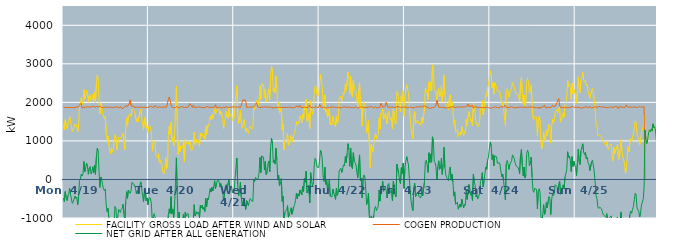
| Category | FACILITY GROSS LOAD AFTER WIND AND SOLAR | COGEN PRODUCTION | NET GRID AFTER ALL GENERATION |
|---|---|---|---|
|  Mon  4/19 | 1412 | 1892 | -480 |
|  Mon  4/19 | 1291 | 1866 | -575 |
|  Mon  4/19 | 1552 | 1867 | -315 |
|  Mon  4/19 | 1397 | 1866 | -469 |
|  Mon  4/19 | 1318 | 1864 | -546 |
|  Mon  4/19 | 1448 | 1869 | -421 |
|  Mon  4/19 | 1499 | 1869 | -370 |
|  Mon  4/19 | 1629 | 1862 | -233 |
|  Mon  4/19 | 1490 | 1882 | -392 |
|  Mon  4/19 | 1362 | 1870 | -508 |
|  Mon  4/19 | 1238 | 1859 | -621 |
|  Mon  4/19 | 1282 | 1861 | -579 |
|  Mon  4/19 | 1300 | 1868 | -568 |
|  Mon  4/19 | 1437 | 1868 | -431 |
|  Mon  4/19 | 1376 | 1870 | -494 |
|  Mon  4/19 | 1420 | 1878 | -458 |
|  Mon  4/19 | 1231 | 1886 | -655 |
|  Mon  4/19 | 1403 | 1878 | -475 |
|  Mon  4/19 | 1889 | 1921 | -32 |
|  Mon  4/19 | 1953 | 1953 | 0 |
|  Mon  4/19 | 2116 | 1979 | 137 |
|  Mon  4/19 | 1944 | 1855 | 89 |
|  Mon  4/19 | 2020 | 1868 | 152 |
|  Mon  4/19 | 2339 | 1873 | 466 |
|  Mon  4/19 | 2080 | 1883 | 197 |
|  Mon  4/19 | 2180 | 1873 | 307 |
|  Mon  4/19 | 2306 | 1883 | 423 |
|  Mon  4/19 | 2222 | 1889 | 333 |
|  Mon  4/19 | 2005 | 1870 | 135 |
|  Mon  4/19 | 2168 | 1873 | 295 |
|  Mon  4/19 | 2199 | 1862 | 337 |
|  Mon  4/19 | 2027 | 1882 | 145 |
|  Mon  4/19 | 2078 | 1878 | 200 |
|  Mon  4/19 | 2217 | 1889 | 328 |
|  Mon  4/19 | 2045 | 1870 | 175 |
|  Mon  4/19 | 2270 | 1897 | 373 |
|  Mon  4/19 | 1995 | 1863 | 132 |
|  Mon  4/19 | 2473 | 1895 | 578 |
|  Mon  4/19 | 2712 | 1905 | 807 |
|  Mon  4/19 | 2614 | 1878 | 736 |
|  Mon  4/19 | 2109 | 1881 | 228 |
|  Mon  4/19 | 1699 | 1905 | -206 |
|  Mon  4/19 | 1980 | 1916 | 64 |
|  Mon  4/19 | 1878 | 1866 | 12 |
|  Mon  4/19 | 1738 | 1878 | -140 |
|  Mon  4/19 | 1617 | 1862 | -245 |
|  Mon  4/19 | 1584 | 1869 | -285 |
|  Mon  4/19 | 1635 | 1879 | -244 |
|  Mon  4/19 | 1233 | 1876 | -643 |
|  Mon  4/19 | 1040 | 1870 | -830 |
|  Mon  4/19 | 1121 | 1870 | -749 |
|  Mon  4/19 | 906 | 1873 | -967 |
|  Mon  4/19 | 749 | 1879 | -1130 |
|  Mon  4/19 | 662 | 1873 | -1211 |
|  Mon  4/19 | 822 | 1886 | -1064 |
|  Mon  4/19 | 706 | 1860 | -1154 |
|  Mon  4/19 | 777 | 1877 | -1100 |
|  Mon  4/19 | 802 | 1873 | -1071 |
|  Mon  4/19 | 1166 | 1870 | -704 |
|  Mon  4/19 | 1132 | 1888 | -756 |
|  Mon  4/19 | 770 | 1870 | -1100 |
|  Mon  4/19 | 869 | 1867 | -998 |
|  Mon  4/19 | 1100 | 1878 | -778 |
|  Mon  4/19 | 1056 | 1857 | -801 |
|  Mon  4/19 | 1039 | 1892 | -853 |
|  Mon  4/19 | 1082 | 1860 | -778 |
|  Mon  4/19 | 1126 | 1876 | -750 |
|  Mon  4/19 | 1196 | 1839 | -643 |
|  Mon  4/19 | 961 | 1852 | -891 |
|  Mon  4/19 | 778 | 1891 | -1113 |
|  Mon  4/19 | 1288 | 1875 | -587 |
|  Mon  4/19 | 1595 | 1912 | -317 |
|  Mon  4/19 | 1395 | 1886 | -491 |
|  Mon  4/19 | 1660 | 1934 | -274 |
|  Mon  4/19 | 1667 | 1981 | -314 |
|  Mon  4/19 | 1704 | 2063 | -359 |
|  Mon  4/19 | 1633 | 1929 | -296 |
|  Mon  4/19 | 1816 | 1891 | -75 |
|  Mon  4/19 | 1802 | 1867 | -65 |
|  Mon  4/19 | 1794 | 1906 | -112 |
|  Mon  4/19 | 1757 | 1867 | -110 |
|  Mon  4/19 | 1622 | 1846 | -224 |
|  Mon  4/19 | 1502 | 1878 | -376 |
|  Mon  4/19 | 1598 | 1889 | -291 |
|  Mon  4/19 | 1507 | 1869 | -362 |
|  Mon  4/19 | 1529 | 1863 | -334 |
|  Mon  4/19 | 1742 | 1879 | -137 |
|  Mon  4/19 | 1817 | 1879 | -62 |
|  Mon  4/19 | 1637 | 1874 | -237 |
|  Mon  4/19 | 1465 | 1876 | -411 |
|  Mon  4/19 | 1287 | 1864 | -577 |
|  Mon  4/19 | 1531 | 1870 | -339 |
|  Mon  4/19 | 1620 | 1877 | -257 |
|  Mon  4/19 | 1331 | 1884 | -553 |
|  Mon  4/19 | 1386 | 1864 | -478 |
|  Mon  4/19 | 1216 | 1871 | -655 |
|  Tue  4/20 | 1373 | 1880 | -507 |
|  Tue  4/20 | 1404 | 1871 | -467 |
|  Tue  4/20 | 1393 | 1898 | -505 |
|  Tue  4/20 | 1224 | 1884 | -660 |
|  Tue  4/20 | 733 | 1874 | -1141 |
|  Tue  4/20 | 906 | 1869 | -963 |
|  Tue  4/20 | 990 | 1877 | -887 |
|  Tue  4/20 | 951 | 1919 | -968 |
|  Tue  4/20 | 616 | 1920 | -1304 |
|  Tue  4/20 | 610 | 1878 | -1268 |
|  Tue  4/20 | 556 | 1866 | -1310 |
|  Tue  4/20 | 667 | 1862 | -1195 |
|  Tue  4/20 | 430 | 1893 | -1463 |
|  Tue  4/20 | 508 | 1873 | -1365 |
|  Tue  4/20 | 412 | 1870 | -1458 |
|  Tue  4/20 | 357 | 1874 | -1517 |
|  Tue  4/20 | 177 | 1879 | -1702 |
|  Tue  4/20 | 140 | 1875 | -1735 |
|  Tue  4/20 | 257 | 1876 | -1619 |
|  Tue  4/20 | 572 | 1854 | -1282 |
|  Tue  4/20 | 276 | 1878 | -1602 |
|  Tue  4/20 | 311 | 1901 | -1590 |
|  Tue  4/20 | 1166 | 2079 | -913 |
|  Tue  4/20 | 1376 | 2139 | -763 |
|  Tue  4/20 | 1165 | 2045 | -880 |
|  Tue  4/20 | 1488 | 1932 | -444 |
|  Tue  4/20 | 983 | 1871 | -888 |
|  Tue  4/20 | 1091 | 1868 | -777 |
|  Tue  4/20 | 876 | 1861 | -985 |
|  Tue  4/20 | 1185 | 1857 | -672 |
|  Tue  4/20 | 1793 | 1866 | -73 |
|  Tue  4/20 | 2425 | 1865 | 560 |
|  Tue  4/20 | 1514 | 1892 | -378 |
|  Tue  4/20 | 645 | 1874 | -1229 |
|  Tue  4/20 | 1008 | 1854 | -846 |
|  Tue  4/20 | 722 | 1873 | -1151 |
|  Tue  4/20 | 867 | 1884 | -1017 |
|  Tue  4/20 | 805 | 1886 | -1081 |
|  Tue  4/20 | 843 | 1885 | -1042 |
|  Tue  4/20 | 988 | 1885 | -897 |
|  Tue  4/20 | 460 | 1866 | -1406 |
|  Tue  4/20 | 1046 | 1890 | -844 |
|  Tue  4/20 | 915 | 1870 | -955 |
|  Tue  4/20 | 950 | 1867 | -917 |
|  Tue  4/20 | 991 | 1872 | -881 |
|  Tue  4/20 | 908 | 1903 | -995 |
|  Tue  4/20 | 987 | 1966 | -979 |
|  Tue  4/20 | 831 | 1941 | -1110 |
|  Tue  4/20 | 738 | 1921 | -1183 |
|  Tue  4/20 | 784 | 1865 | -1081 |
|  Tue  4/20 | 886 | 1926 | -1040 |
|  Tue  4/20 | 1228 | 1880 | -652 |
|  Tue  4/20 | 908 | 1854 | -946 |
|  Tue  4/20 | 943 | 1871 | -928 |
|  Tue  4/20 | 1038 | 1875 | -837 |
|  Tue  4/20 | 959 | 1850 | -891 |
|  Tue  4/20 | 1023 | 1881 | -858 |
|  Tue  4/20 | 864 | 1858 | -994 |
|  Tue  4/20 | 1205 | 1877 | -672 |
|  Tue  4/20 | 1133 | 1874 | -741 |
|  Tue  4/20 | 1193 | 1859 | -666 |
|  Tue  4/20 | 1090 | 1867 | -777 |
|  Tue  4/20 | 1146 | 1866 | -720 |
|  Tue  4/20 | 1041 | 1874 | -833 |
|  Tue  4/20 | 1385 | 1874 | -489 |
|  Tue  4/20 | 1165 | 1879 | -714 |
|  Tue  4/20 | 1403 | 1894 | -491 |
|  Tue  4/20 | 1360 | 1890 | -530 |
|  Tue  4/20 | 1478 | 1865 | -387 |
|  Tue  4/20 | 1636 | 1875 | -239 |
|  Tue  4/20 | 1548 | 1875 | -327 |
|  Tue  4/20 | 1687 | 1894 | -207 |
|  Tue  4/20 | 1568 | 1866 | -298 |
|  Tue  4/20 | 1677 | 1871 | -194 |
|  Tue  4/20 | 1843 | 1874 | -31 |
|  Tue  4/20 | 1703 | 1939 | -236 |
|  Tue  4/20 | 1750 | 1869 | -119 |
|  Tue  4/20 | 1826 | 1865 | -39 |
|  Tue  4/20 | 1847 | 1860 | -13 |
|  Tue  4/20 | 1821 | 1880 | -59 |
|  Tue  4/20 | 1688 | 1881 | -193 |
|  Tue  4/20 | 1763 | 1865 | -102 |
|  Tue  4/20 | 1744 | 1846 | -102 |
|  Tue  4/20 | 1619 | 1864 | -245 |
|  Tue  4/20 | 1327 | 1875 | -548 |
|  Tue  4/20 | 1463 | 1869 | -406 |
|  Tue  4/20 | 1596 | 1863 | -267 |
|  Tue  4/20 | 1765 | 1899 | -134 |
|  Tue  4/20 | 1636 | 1914 | -278 |
|  Tue  4/20 | 1579 | 1858 | -279 |
|  Tue  4/20 | 1871 | 1871 | 0 |
|  Tue  4/20 | 1636 | 1874 | -238 |
|  Tue  4/20 | 1650 | 1871 | -221 |
|  Tue  4/20 | 1711 | 1879 | -168 |
|  Tue  4/20 | 1529 | 1872 | -343 |
|  Tue  4/20 | 1546 | 1882 | -336 |
|  Wed  4/21 | 1589 | 1877 | -288 |
|  Wed  4/21 | 1901 | 1879 | 22 |
|  Wed  4/21 | 2195 | 1882 | 313 |
|  Wed  4/21 | 2430 | 1874 | 556 |
|  Wed  4/21 | 1721 | 1855 | -134 |
|  Wed  4/21 | 1456 | 1882 | -426 |
|  Wed  4/21 | 1593 | 1864 | -271 |
|  Wed  4/21 | 1795 | 1868 | -73 |
|  Wed  4/21 | 1459 | 1923 | -464 |
|  Wed  4/21 | 1330 | 2009 | -679 |
|  Wed  4/21 | 1397 | 2069 | -672 |
|  Wed  4/21 | 1553 | 2037 | -484 |
|  Wed  4/21 | 1416 | 2070 | -654 |
|  Wed  4/21 | 1246 | 2026 | -780 |
|  Wed  4/21 | 1322 | 1871 | -549 |
|  Wed  4/21 | 1346 | 1879 | -533 |
|  Wed  4/21 | 1195 | 1871 | -676 |
|  Wed  4/21 | 1314 | 1896 | -582 |
|  Wed  4/21 | 1378 | 1873 | -495 |
|  Wed  4/21 | 1332 | 1867 | -535 |
|  Wed  4/21 | 1352 | 1879 | -527 |
|  Wed  4/21 | 1312 | 1886 | -574 |
|  Wed  4/21 | 1865 | 1877 | -12 |
|  Wed  4/21 | 1818 | 1877 | -59 |
|  Wed  4/21 | 1989 | 1937 | 52 |
|  Wed  4/21 | 2063 | 1992 | 71 |
|  Wed  4/21 | 1983 | 1986 | -3 |
|  Wed  4/21 | 1913 | 1880 | 33 |
|  Wed  4/21 | 2054 | 1888 | 166 |
|  Wed  4/21 | 2433 | 1862 | 571 |
|  Wed  4/21 | 2062 | 1884 | 178 |
|  Wed  4/21 | 2487 | 1875 | 612 |
|  Wed  4/21 | 2503 | 1886 | 617 |
|  Wed  4/21 | 2460 | 1881 | 579 |
|  Wed  4/21 | 2115 | 1872 | 243 |
|  Wed  4/21 | 2347 | 1882 | 465 |
|  Wed  4/21 | 2007 | 1885 | 122 |
|  Wed  4/21 | 2040 | 1879 | 161 |
|  Wed  4/21 | 2271 | 1863 | 408 |
|  Wed  4/21 | 2348 | 1871 | 477 |
|  Wed  4/21 | 2069 | 1866 | 203 |
|  Wed  4/21 | 2702 | 1875 | 827 |
|  Wed  4/21 | 2942 | 1875 | 1067 |
|  Wed  4/21 | 2806 | 1875 | 931 |
|  Wed  4/21 | 2279 | 1837 | 442 |
|  Wed  4/21 | 2366 | 1868 | 498 |
|  Wed  4/21 | 2255 | 1857 | 398 |
|  Wed  4/21 | 2680 | 1870 | 810 |
|  Wed  4/21 | 2365 | 1852 | 513 |
|  Wed  4/21 | 1862 | 1869 | -7 |
|  Wed  4/21 | 2002 | 1891 | 111 |
|  Wed  4/21 | 1718 | 1880 | -162 |
|  Wed  4/21 | 1737 | 1869 | -132 |
|  Wed  4/21 | 1879 | 1859 | 20 |
|  Wed  4/21 | 1300 | 1867 | -567 |
|  Wed  4/21 | 1433 | 1871 | -438 |
|  Wed  4/21 | 770 | 1871 | -1101 |
|  Wed  4/21 | 1012 | 1874 | -862 |
|  Wed  4/21 | 1035 | 1883 | -848 |
|  Wed  4/21 | 1087 | 1868 | -781 |
|  Wed  4/21 | 1192 | 1872 | -680 |
|  Wed  4/21 | 889 | 1868 | -979 |
|  Wed  4/21 | 947 | 1872 | -925 |
|  Wed  4/21 | 961 | 1877 | -916 |
|  Wed  4/21 | 1139 | 1873 | -734 |
|  Wed  4/21 | 961 | 1863 | -902 |
|  Wed  4/21 | 954 | 1862 | -908 |
|  Wed  4/21 | 1147 | 1859 | -712 |
|  Wed  4/21 | 1198 | 1850 | -652 |
|  Wed  4/21 | 1340 | 1881 | -541 |
|  Wed  4/21 | 1511 | 1866 | -355 |
|  Wed  4/21 | 1405 | 1911 | -506 |
|  Wed  4/21 | 1497 | 1866 | -369 |
|  Wed  4/21 | 1455 | 1884 | -429 |
|  Wed  4/21 | 1652 | 1924 | -272 |
|  Wed  4/21 | 1583 | 1860 | -277 |
|  Wed  4/21 | 1473 | 1874 | -401 |
|  Wed  4/21 | 1696 | 1867 | -171 |
|  Wed  4/21 | 1566 | 1877 | -311 |
|  Wed  4/21 | 1905 | 1876 | 29 |
|  Wed  4/21 | 1811 | 1883 | -72 |
|  Wed  4/21 | 2086 | 1868 | 218 |
|  Wed  4/21 | 1511 | 1861 | -350 |
|  Wed  4/21 | 1573 | 1863 | -290 |
|  Wed  4/21 | 1724 | 1873 | -149 |
|  Wed  4/21 | 1320 | 1931 | -611 |
|  Wed  4/21 | 2044 | 1869 | 175 |
|  Wed  4/21 | 1866 | 1884 | -18 |
|  Wed  4/21 | 1693 | 1865 | -172 |
|  Wed  4/21 | 1753 | 1876 | -123 |
|  Wed  4/21 | 2228 | 1864 | 364 |
|  Wed  4/21 | 2431 | 1881 | 550 |
|  Wed  4/21 | 2405 | 1896 | 509 |
|  Wed  4/21 | 2195 | 1866 | 329 |
|  Wed  4/21 | 2194 | 1870 | 324 |
|  Wed  4/21 | 2171 | 1866 | 305 |
|  Thu  4/22 | 2428 | 1953 | 475 |
|  Thu  4/22 | 2726 | 1969 | 757 |
|  Thu  4/22 | 2557 | 1861 | 696 |
|  Thu  4/22 | 2418 | 1873 | 545 |
|  Thu  4/22 | 1965 | 1875 | 90 |
|  Thu  4/22 | 1820 | 1871 | -51 |
|  Thu  4/22 | 2192 | 1874 | 318 |
|  Thu  4/22 | 1741 | 1869 | -128 |
|  Thu  4/22 | 1826 | 1845 | -19 |
|  Thu  4/22 | 1615 | 1873 | -258 |
|  Thu  4/22 | 1695 | 1884 | -189 |
|  Thu  4/22 | 1872 | 1864 | 8 |
|  Thu  4/22 | 1422 | 1855 | -433 |
|  Thu  4/22 | 1456 | 1872 | -416 |
|  Thu  4/22 | 1413 | 1864 | -451 |
|  Thu  4/22 | 1637 | 1884 | -247 |
|  Thu  4/22 | 1510 | 1870 | -360 |
|  Thu  4/22 | 1440 | 1872 | -432 |
|  Thu  4/22 | 1361 | 1877 | -516 |
|  Thu  4/22 | 1642 | 1868 | -226 |
|  Thu  4/22 | 1460 | 1873 | -413 |
|  Thu  4/22 | 1510 | 1869 | -359 |
|  Thu  4/22 | 2082 | 1869 | 213 |
|  Thu  4/22 | 2093 | 1860 | 233 |
|  Thu  4/22 | 2165 | 1877 | 288 |
|  Thu  4/22 | 2046 | 1863 | 183 |
|  Thu  4/22 | 2148 | 1865 | 283 |
|  Thu  4/22 | 2265 | 1883 | 382 |
|  Thu  4/22 | 2219 | 1866 | 353 |
|  Thu  4/22 | 2475 | 1881 | 594 |
|  Thu  4/22 | 2305 | 1877 | 428 |
|  Thu  4/22 | 2538 | 1866 | 672 |
|  Thu  4/22 | 2778 | 1849 | 929 |
|  Thu  4/22 | 2659 | 1880 | 779 |
|  Thu  4/22 | 2225 | 1885 | 340 |
|  Thu  4/22 | 2678 | 1864 | 814 |
|  Thu  4/22 | 2203 | 1875 | 328 |
|  Thu  4/22 | 2143 | 1864 | 279 |
|  Thu  4/22 | 2581 | 1886 | 695 |
|  Thu  4/22 | 2337 | 1861 | 476 |
|  Thu  4/22 | 2302 | 1868 | 434 |
|  Thu  4/22 | 2269 | 1890 | 379 |
|  Thu  4/22 | 2069 | 1889 | 180 |
|  Thu  4/22 | 1891 | 1850 | 41 |
|  Thu  4/22 | 2284 | 1871 | 413 |
|  Thu  4/22 | 2509 | 1872 | 637 |
|  Thu  4/22 | 1831 | 1868 | -37 |
|  Thu  4/22 | 1918 | 1881 | 37 |
|  Thu  4/22 | 1386 | 1866 | -480 |
|  Thu  4/22 | 1913 | 1874 | 39 |
|  Thu  4/22 | 2002 | 1884 | 118 |
|  Thu  4/22 | 1929 | 1866 | 63 |
|  Thu  4/22 | 1587 | 1857 | -270 |
|  Thu  4/22 | 1214 | 1864 | -650 |
|  Thu  4/22 | 1330 | 1875 | -545 |
|  Thu  4/22 | 1528 | 1881 | -353 |
|  Thu  4/22 | 941 | 1878 | -937 |
|  Thu  4/22 | 314 | 1880 | -1566 |
|  Thu  4/22 | 915 | 1860 | -945 |
|  Thu  4/22 | 912 | 1888 | -976 |
|  Thu  4/22 | 727 | 1866 | -1139 |
|  Thu  4/22 | 928 | 1853 | -925 |
|  Thu  4/22 | 1115 | 1876 | -761 |
|  Thu  4/22 | 1187 | 1886 | -699 |
|  Thu  4/22 | 1052 | 1860 | -808 |
|  Thu  4/22 | 1128 | 1883 | -755 |
|  Thu  4/22 | 1167 | 1860 | -693 |
|  Thu  4/22 | 1600 | 1871 | -271 |
|  Thu  4/22 | 1306 | 1869 | -563 |
|  Thu  4/22 | 1708 | 1984 | -276 |
|  Thu  4/22 | 1737 | 1977 | -240 |
|  Thu  4/22 | 1830 | 1873 | -43 |
|  Thu  4/22 | 1563 | 1869 | -306 |
|  Thu  4/22 | 1628 | 1881 | -253 |
|  Thu  4/22 | 1726 | 1911 | -185 |
|  Thu  4/22 | 1724 | 2003 | -279 |
|  Thu  4/22 | 1445 | 1925 | -480 |
|  Thu  4/22 | 1730 | 1867 | -137 |
|  Thu  4/22 | 1770 | 1872 | -102 |
|  Thu  4/22 | 1589 | 1874 | -285 |
|  Thu  4/22 | 1533 | 1882 | -349 |
|  Thu  4/22 | 1611 | 1876 | -265 |
|  Thu  4/22 | 1316 | 1873 | -557 |
|  Thu  4/22 | 1826 | 1876 | -50 |
|  Thu  4/22 | 1677 | 1885 | -208 |
|  Thu  4/22 | 1462 | 1865 | -403 |
|  Thu  4/22 | 1432 | 1886 | -454 |
|  Thu  4/22 | 2284 | 1888 | 396 |
|  Thu  4/22 | 2248 | 1871 | 377 |
|  Thu  4/22 | 2049 | 1886 | 163 |
|  Thu  4/22 | 1839 | 1881 | -42 |
|  Thu  4/22 | 1758 | 1867 | -109 |
|  Thu  4/22 | 2168 | 1862 | 306 |
|  Thu  4/22 | 2022 | 1874 | 148 |
|  Thu  4/22 | 2304 | 1878 | 426 |
|  Thu  4/22 | 1642 | 1876 | -234 |
|  Fri  4/23 | 2155 | 1869 | 286 |
|  Fri  4/23 | 2352 | 1880 | 472 |
|  Fri  4/23 | 2456 | 1865 | 591 |
|  Fri  4/23 | 2331 | 1850 | 481 |
|  Fri  4/23 | 2248 | 1868 | 380 |
|  Fri  4/23 | 1906 | 1878 | 28 |
|  Fri  4/23 | 1894 | 1888 | 6 |
|  Fri  4/23 | 1292 | 1870 | -578 |
|  Fri  4/23 | 1141 | 1867 | -726 |
|  Fri  4/23 | 1055 | 1863 | -808 |
|  Fri  4/23 | 1672 | 1879 | -207 |
|  Fri  4/23 | 1762 | 1859 | -97 |
|  Fri  4/23 | 1441 | 1887 | -446 |
|  Fri  4/23 | 1488 | 1880 | -392 |
|  Fri  4/23 | 1543 | 1878 | -335 |
|  Fri  4/23 | 1504 | 1872 | -368 |
|  Fri  4/23 | 1434 | 1883 | -449 |
|  Fri  4/23 | 1426 | 1870 | -444 |
|  Fri  4/23 | 1410 | 1885 | -475 |
|  Fri  4/23 | 1622 | 1882 | -260 |
|  Fri  4/23 | 1460 | 1885 | -425 |
|  Fri  4/23 | 1439 | 1889 | -450 |
|  Fri  4/23 | 1855 | 1915 | -60 |
|  Fri  4/23 | 2368 | 1902 | 466 |
|  Fri  4/23 | 2377 | 1879 | 498 |
|  Fri  4/23 | 2247 | 1862 | 385 |
|  Fri  4/23 | 2062 | 1880 | 182 |
|  Fri  4/23 | 2537 | 1844 | 693 |
|  Fri  4/23 | 2297 | 1859 | 438 |
|  Fri  4/23 | 2514 | 1852 | 662 |
|  Fri  4/23 | 2302 | 1855 | 447 |
|  Fri  4/23 | 2972 | 1866 | 1106 |
|  Fri  4/23 | 2865 | 1873 | 992 |
|  Fri  4/23 | 2336 | 1868 | 468 |
|  Fri  4/23 | 2325 | 1890 | 435 |
|  Fri  4/23 | 2250 | 1931 | 319 |
|  Fri  4/23 | 2036 | 2052 | -16 |
|  Fri  4/23 | 2291 | 1961 | 330 |
|  Fri  4/23 | 2360 | 1875 | 485 |
|  Fri  4/23 | 2138 | 1877 | 261 |
|  Fri  4/23 | 2167 | 1875 | 292 |
|  Fri  4/23 | 2427 | 1876 | 551 |
|  Fri  4/23 | 2004 | 1871 | 133 |
|  Fri  4/23 | 2277 | 1891 | 386 |
|  Fri  4/23 | 2703 | 1868 | 835 |
|  Fri  4/23 | 2186 | 1876 | 310 |
|  Fri  4/23 | 1970 | 1851 | 119 |
|  Fri  4/23 | 1919 | 1870 | 49 |
|  Fri  4/23 | 1909 | 1865 | 44 |
|  Fri  4/23 | 1811 | 1842 | -31 |
|  Fri  4/23 | 2098 | 1863 | 235 |
|  Fri  4/23 | 2197 | 1872 | 325 |
|  Fri  4/23 | 1861 | 1880 | -19 |
|  Fri  4/23 | 2002 | 1869 | 133 |
|  Fri  4/23 | 1817 | 1886 | -69 |
|  Fri  4/23 | 1432 | 1864 | -432 |
|  Fri  4/23 | 1549 | 1871 | -322 |
|  Fri  4/23 | 1227 | 1869 | -642 |
|  Fri  4/23 | 1215 | 1871 | -656 |
|  Fri  4/23 | 1289 | 1879 | -590 |
|  Fri  4/23 | 1112 | 1883 | -771 |
|  Fri  4/23 | 1093 | 1861 | -768 |
|  Fri  4/23 | 1232 | 1872 | -640 |
|  Fri  4/23 | 1152 | 1870 | -718 |
|  Fri  4/23 | 1372 | 1884 | -512 |
|  Fri  4/23 | 1253 | 1876 | -623 |
|  Fri  4/23 | 1141 | 1879 | -738 |
|  Fri  4/23 | 1245 | 1887 | -642 |
|  Fri  4/23 | 1213 | 1881 | -668 |
|  Fri  4/23 | 1566 | 1863 | -297 |
|  Fri  4/23 | 1393 | 1911 | -518 |
|  Fri  4/23 | 1620 | 1956 | -336 |
|  Fri  4/23 | 1757 | 1886 | -129 |
|  Fri  4/23 | 1642 | 1903 | -261 |
|  Fri  4/23 | 1506 | 1914 | -408 |
|  Fri  4/23 | 1567 | 1881 | -314 |
|  Fri  4/23 | 1386 | 1932 | -546 |
|  Fri  4/23 | 1985 | 1846 | 139 |
|  Fri  4/23 | 1825 | 1886 | -61 |
|  Fri  4/23 | 1728 | 1877 | -149 |
|  Fri  4/23 | 1431 | 1886 | -455 |
|  Fri  4/23 | 1470 | 1864 | -394 |
|  Fri  4/23 | 1357 | 1863 | -506 |
|  Fri  4/23 | 1383 | 1868 | -485 |
|  Fri  4/23 | 1502 | 1870 | -368 |
|  Fri  4/23 | 1805 | 1854 | -49 |
|  Fri  4/23 | 1866 | 1863 | 3 |
|  Fri  4/23 | 2052 | 1875 | 177 |
|  Fri  4/23 | 1679 | 1870 | -191 |
|  Fri  4/23 | 1836 | 1868 | -32 |
|  Fri  4/23 | 2014 | 1862 | 152 |
|  Fri  4/23 | 2202 | 1878 | 324 |
|  Fri  4/23 | 2147 | 1882 | 265 |
|  Fri  4/23 | 2385 | 1889 | 496 |
|  Fri  4/23 | 2447 | 1863 | 584 |
|  Fri  4/23 | 2657 | 1849 | 808 |
|  Sat  4/24 | 2821 | 1848 | 973 |
|  Sat  4/24 | 2728 | 1858 | 870 |
|  Sat  4/24 | 2377 | 1859 | 518 |
|  Sat  4/24 | 2508 | 1865 | 643 |
|  Sat  4/24 | 2217 | 1866 | 351 |
|  Sat  4/24 | 2512 | 1899 | 613 |
|  Sat  4/24 | 2463 | 1870 | 593 |
|  Sat  4/24 | 2478 | 1888 | 590 |
|  Sat  4/24 | 2291 | 1871 | 420 |
|  Sat  4/24 | 2293 | 1891 | 402 |
|  Sat  4/24 | 2290 | 1855 | 435 |
|  Sat  4/24 | 2256 | 1873 | 383 |
|  Sat  4/24 | 2101 | 1899 | 202 |
|  Sat  4/24 | 1940 | 1872 | 68 |
|  Sat  4/24 | 2011 | 1871 | 140 |
|  Sat  4/24 | 1835 | 1879 | -44 |
|  Sat  4/24 | 1848 | 1881 | -33 |
|  Sat  4/24 | 1401 | 1931 | -530 |
|  Sat  4/24 | 2268 | 1864 | 404 |
|  Sat  4/24 | 2353 | 1860 | 493 |
|  Sat  4/24 | 2273 | 1863 | 410 |
|  Sat  4/24 | 2130 | 1868 | 262 |
|  Sat  4/24 | 2259 | 1873 | 386 |
|  Sat  4/24 | 2261 | 1882 | 379 |
|  Sat  4/24 | 2375 | 1890 | 485 |
|  Sat  4/24 | 2513 | 1875 | 638 |
|  Sat  4/24 | 2491 | 1863 | 628 |
|  Sat  4/24 | 2405 | 1864 | 541 |
|  Sat  4/24 | 2284 | 1861 | 423 |
|  Sat  4/24 | 2226 | 1872 | 354 |
|  Sat  4/24 | 2236 | 1870 | 366 |
|  Sat  4/24 | 2201 | 1881 | 320 |
|  Sat  4/24 | 2138 | 1871 | 267 |
|  Sat  4/24 | 2023 | 1874 | 149 |
|  Sat  4/24 | 2491 | 1878 | 613 |
|  Sat  4/24 | 2648 | 1872 | 776 |
|  Sat  4/24 | 2253 | 1877 | 376 |
|  Sat  4/24 | 1967 | 1873 | 94 |
|  Sat  4/24 | 2189 | 1866 | 323 |
|  Sat  4/24 | 1910 | 1873 | 37 |
|  Sat  4/24 | 1997 | 1883 | 114 |
|  Sat  4/24 | 2545 | 1870 | 675 |
|  Sat  4/24 | 2620 | 1861 | 759 |
|  Sat  4/24 | 2534 | 1851 | 683 |
|  Sat  4/24 | 2238 | 1884 | 354 |
|  Sat  4/24 | 2264 | 1867 | 397 |
|  Sat  4/24 | 2457 | 1878 | 579 |
|  Sat  4/24 | 1930 | 1864 | 66 |
|  Sat  4/24 | 1592 | 1877 | -285 |
|  Sat  4/24 | 1537 | 1871 | -334 |
|  Sat  4/24 | 1634 | 1865 | -231 |
|  Sat  4/24 | 1644 | 1860 | -216 |
|  Sat  4/24 | 1611 | 1865 | -254 |
|  Sat  4/24 | 1122 | 1885 | -763 |
|  Sat  4/24 | 1537 | 1848 | -311 |
|  Sat  4/24 | 1640 | 1881 | -241 |
|  Sat  4/24 | 1499 | 1842 | -343 |
|  Sat  4/24 | 909 | 1878 | -969 |
|  Sat  4/24 | 800 | 1893 | -1093 |
|  Sat  4/24 | 950 | 1874 | -924 |
|  Sat  4/24 | 1218 | 1872 | -654 |
|  Sat  4/24 | 1024 | 1933 | -909 |
|  Sat  4/24 | 990 | 1858 | -868 |
|  Sat  4/24 | 1277 | 1874 | -597 |
|  Sat  4/24 | 1133 | 1870 | -737 |
|  Sat  4/24 | 1141 | 1876 | -735 |
|  Sat  4/24 | 1426 | 1873 | -447 |
|  Sat  4/24 | 1371 | 1872 | -501 |
|  Sat  4/24 | 947 | 1859 | -912 |
|  Sat  4/24 | 1349 | 1875 | -526 |
|  Sat  4/24 | 1563 | 1925 | -362 |
|  Sat  4/24 | 1464 | 1882 | -418 |
|  Sat  4/24 | 1507 | 1870 | -363 |
|  Sat  4/24 | 1759 | 1895 | -136 |
|  Sat  4/24 | 1760 | 1881 | -121 |
|  Sat  4/24 | 1809 | 1993 | -184 |
|  Sat  4/24 | 1729 | 2008 | -279 |
|  Sat  4/24 | 1835 | 2100 | -265 |
|  Sat  4/24 | 1879 | 1927 | -48 |
|  Sat  4/24 | 1484 | 1865 | -381 |
|  Sat  4/24 | 1524 | 1880 | -356 |
|  Sat  4/24 | 1648 | 1868 | -220 |
|  Sat  4/24 | 1727 | 1867 | -140 |
|  Sat  4/24 | 1614 | 1861 | -247 |
|  Sat  4/24 | 1926 | 1871 | 55 |
|  Sat  4/24 | 1951 | 1876 | 75 |
|  Sat  4/24 | 2113 | 1858 | 255 |
|  Sat  4/24 | 2571 | 1852 | 719 |
|  Sat  4/24 | 2412 | 1839 | 573 |
|  Sat  4/24 | 2481 | 1872 | 609 |
|  Sat  4/24 | 2381 | 1878 | 503 |
|  Sat  4/24 | 2076 | 1870 | 206 |
|  Sat  4/24 | 2498 | 1906 | 592 |
|  Sat  4/24 | 2225 | 1890 | 335 |
|  Sat  4/24 | 2343 | 1872 | 471 |
|  Sat  4/24 | 2254 | 1880 | 374 |
|  Sun  4/25 | 2183 | 1876 | 307 |
|  Sun  4/25 | 1978 | 1877 | 101 |
|  Sun  4/25 | 2292 | 1874 | 418 |
|  Sun  4/25 | 2668 | 1880 | 788 |
|  Sun  4/25 | 2329 | 1876 | 453 |
|  Sun  4/25 | 2251 | 1864 | 387 |
|  Sun  4/25 | 2599 | 1850 | 749 |
|  Sun  4/25 | 2636 | 1869 | 767 |
|  Sun  4/25 | 2781 | 1855 | 926 |
|  Sun  4/25 | 2585 | 1872 | 713 |
|  Sun  4/25 | 2524 | 1880 | 644 |
|  Sun  4/25 | 2571 | 1866 | 705 |
|  Sun  4/25 | 2423 | 1887 | 536 |
|  Sun  4/25 | 2464 | 1888 | 576 |
|  Sun  4/25 | 2294 | 1857 | 437 |
|  Sun  4/25 | 2276 | 1887 | 389 |
|  Sun  4/25 | 2101 | 1872 | 229 |
|  Sun  4/25 | 2118 | 1876 | 242 |
|  Sun  4/25 | 2308 | 1847 | 461 |
|  Sun  4/25 | 2359 | 1857 | 502 |
|  Sun  4/25 | 2230 | 1875 | 355 |
|  Sun  4/25 | 2061 | 1872 | 189 |
|  Sun  4/25 | 1789 | 1881 | -92 |
|  Sun  4/25 | 1433 | 1858 | -425 |
|  Sun  4/25 | 1375 | 1866 | -491 |
|  Sun  4/25 | 1128 | 1854 | -726 |
|  Sun  4/25 | 1138 | 1892 | -754 |
|  Sun  4/25 | 1151 | 1867 | -716 |
|  Sun  4/25 | 1165 | 1892 | -727 |
|  Sun  4/25 | 1108 | 1866 | -758 |
|  Sun  4/25 | 1043 | 1874 | -831 |
|  Sun  4/25 | 981 | 1887 | -906 |
|  Sun  4/25 | 975 | 1887 | -912 |
|  Sun  4/25 | 917 | 1872 | -955 |
|  Sun  4/25 | 869 | 1853 | -984 |
|  Sun  4/25 | 978 | 1863 | -885 |
|  Sun  4/25 | 826 | 1866 | -1040 |
|  Sun  4/25 | 777 | 1863 | -1086 |
|  Sun  4/25 | 879 | 1873 | -994 |
|  Sun  4/25 | 899 | 1886 | -987 |
|  Sun  4/25 | 924 | 1869 | -945 |
|  Sun  4/25 | 587 | 1862 | -1275 |
|  Sun  4/25 | 484 | 1866 | -1382 |
|  Sun  4/25 | 840 | 1881 | -1041 |
|  Sun  4/25 | 667 | 1882 | -1215 |
|  Sun  4/25 | 751 | 1891 | -1140 |
|  Sun  4/25 | 730 | 1876 | -1146 |
|  Sun  4/25 | 904 | 1883 | -979 |
|  Sun  4/25 | 590 | 1836 | -1246 |
|  Sun  4/25 | 520 | 1889 | -1369 |
|  Sun  4/25 | 777 | 1868 | -1091 |
|  Sun  4/25 | 1035 | 1877 | -842 |
|  Sun  4/25 | 768 | 1873 | -1105 |
|  Sun  4/25 | 580 | 1879 | -1299 |
|  Sun  4/25 | 555 | 1864 | -1309 |
|  Sun  4/25 | 427 | 1861 | -1434 |
|  Sun  4/25 | 146 | 1881 | -1735 |
|  Sun  4/25 | 300 | 1937 | -1637 |
|  Sun  4/25 | 569 | 1883 | -1314 |
|  Sun  4/25 | 847 | 1871 | -1024 |
|  Sun  4/25 | 727 | 1879 | -1152 |
|  Sun  4/25 | 961 | 1870 | -909 |
|  Sun  4/25 | 1059 | 1878 | -819 |
|  Sun  4/25 | 987 | 1864 | -877 |
|  Sun  4/25 | 1100 | 1873 | -773 |
|  Sun  4/25 | 1184 | 1884 | -700 |
|  Sun  4/25 | 1357 | 1878 | -521 |
|  Sun  4/25 | 1518 | 1875 | -357 |
|  Sun  4/25 | 1479 | 1874 | -395 |
|  Sun  4/25 | 1149 | 1885 | -736 |
|  Sun  4/25 | 1139 | 1866 | -727 |
|  Sun  4/25 | 1063 | 1892 | -829 |
|  Sun  4/25 | 903 | 1875 | -972 |
|  Sun  4/25 | 1010 | 1878 | -868 |
|  Sun  4/25 | 1200 | 1862 | -662 |
|  Sun  4/25 | 1195 | 1879 | -684 |
|  Sun  4/25 | 1367 | 1884 | -517 |
|  Sun  4/25 | 1676 | 1888 | -212 |
|  Sun  4/25 | 1285 | 0 | 1285 |
|  Sun  4/25 | 1036 | 0 | 1036 |
|  Sun  4/25 | 932 | 0 | 932 |
|  Sun  4/25 | 1040 | 0 | 1040 |
|  Sun  4/25 | 1207 | 0 | 1207 |
|  Sun  4/25 | 1288 | 0 | 1288 |
|  Sun  4/25 | 1232 | 0 | 1232 |
|  Sun  4/25 | 1313 | 0 | 1313 |
|  Sun  4/25 | 1254 | 0 | 1254 |
|  Sun  4/25 | 1443 | 0 | 1443 |
|  Sun  4/25 | 1341 | 0 | 1341 |
|  Sun  4/25 | 1372 | 0 | 1372 |
|  Sun  4/25 | 1231 | 0 | 1231 |
|  Sun  4/25 | 950 | 0 | 950 |